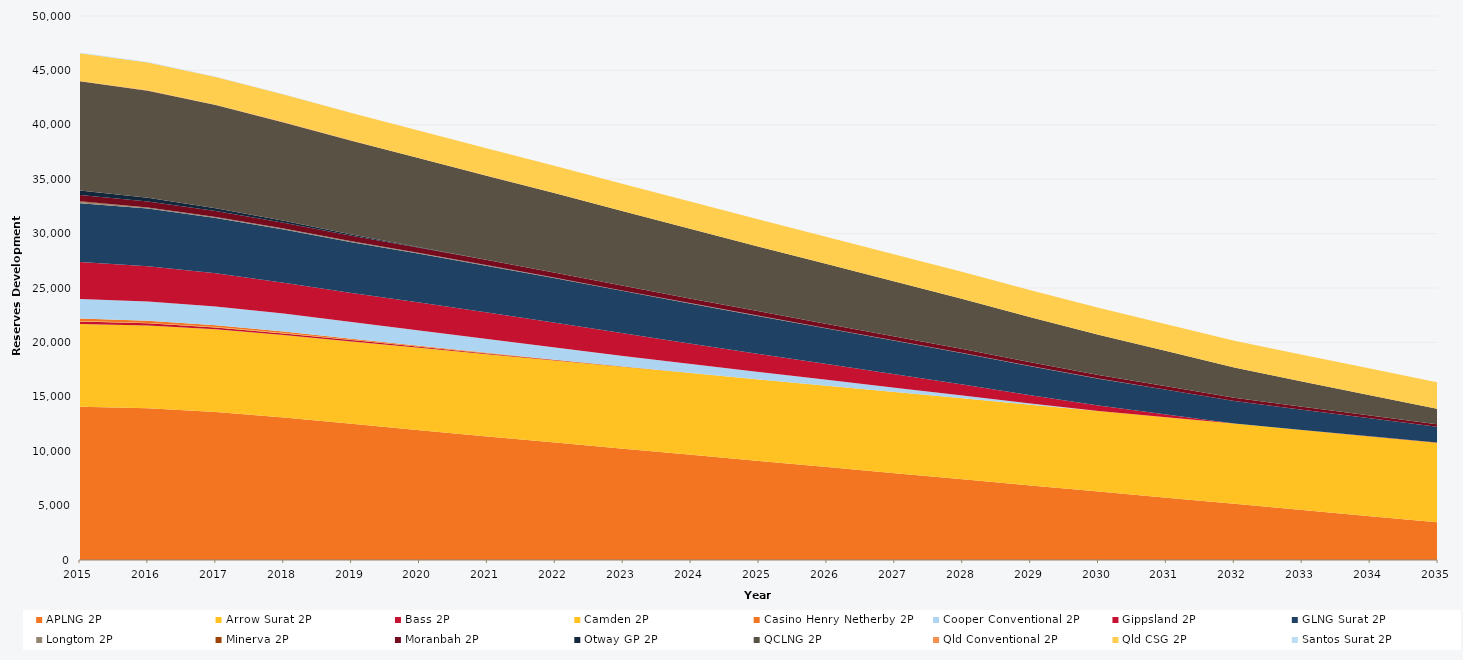
| Category | APLNG 2P | Arrow Surat 2P | Bass 2P | Camden 2P | Casino Henry Netherby 2P | Cooper Conventional 2P | Gippsland 2P | GLNG Surat 2P | Longtom 2P | Minerva 2P | Moranbah 2P | Otway GP 2P | QCLNG 2P | Qld Conventional 2P | Qld CSG 2P | Santos Surat 2P |
|---|---|---|---|---|---|---|---|---|---|---|---|---|---|---|---|---|
| 2015.0 | 14091 | 7605.789 | 221.176 | 45 | 225.66 | 1792.804 | 3415.402 | 5391 | 113.032 | 82.809 | 570 | 410.531 | 10028 | 41.53 | 2549.688 | 38.3 |
| 2016.0 | 13948.878 | 7605.789 | 196.721 | 39.525 | 196.46 | 1761.175 | 3261.827 | 5288.41 | 104.032 | 0 | 553.957 | 335.706 | 9845.121 | 41.53 | 2544.213 | 38.3 |
| 2017.0 | 13609.017 | 7599.232 | 172.199 | 34.035 | 167.18 | 1724.866 | 3042.351 | 5086.378 | 94.882 | 0 | 538.697 | 260.676 | 9487.928 | 36.822 | 2538.723 | 30.866 |
| 2018.0 | 13092.464 | 7586.853 | 147.744 | 28.56 | 137.98 | 1656.686 | 2843.47 | 4884.898 | 85.957 | 0 | 524.028 | 185.851 | 9046.743 | 28.792 | 2533.248 | 19.916 |
| 2019.0 | 12513.539 | 7577.274 | 123.289 | 23.085 | 108.78 | 1536.533 | 2649.076 | 4683.418 | 81.307 | 0 | 509.532 | 111.026 | 8609.478 | 20.762 | 2527.773 | 8.966 |
| 2020.0 | 11933.609 | 7567.783 | 98.834 | 17.61 | 79.58 | 1399.383 | 2568.693 | 4481.938 | 67.732 | 0 | 495.224 | 36.201 | 8172.239 | 12.732 | 2522.298 | 0 |
| 2021.0 | 11352.535 | 7558.157 | 74.312 | 12.12 | 50.3 | 1263.78 | 2439.401 | 4279.906 | 60.832 | 0 | 480.18 | 0 | 7733.696 | 4.68 | 2516.808 | 0 |
| 2022.0 | 10791.911 | 7543.751 | 49.857 | 6.645 | 21.1 | 1115.797 | 2277.988 | 4078.426 | 58.507 | 0 | 464.06 | 0 | 7291.426 | 0 | 2511.333 | 0 |
| 2023.0 | 10231.292 | 7527.747 | 25.402 | 1.17 | 0 | 969.633 | 2084.798 | 3876.946 | 36.077 | 0 | 447.743 | 0 | 6847.223 | 0 | 2505.858 | 0 |
| 2024.0 | 9670.038 | 7509.964 | 0.947 | 0 | 0 | 826.645 | 1877.691 | 3675.466 | 27.077 | 0 | 431.644 | 0 | 6398.108 | 0 | 2500.383 | 0 |
| 2025.0 | 9106.759 | 7492.322 | 0 | 0 | 0 | 683.437 | 1657.277 | 3473.434 | 27.077 | 0 | 414.885 | 0 | 5946.954 | 0 | 2494.893 | 0 |
| 2026.0 | 8545.321 | 7474.44 | 0 | 0 | 0 | 540.838 | 1444.521 | 3271.954 | 24.752 | 0 | 398.138 | 0 | 5499.141 | 0 | 2489.418 | 0 |
| 2027.0 | 7983.448 | 7457.619 | 0 | 0 | 0 | 398.439 | 1234.849 | 3070.474 | 18.994 | 0 | 381.016 | 0 | 5047.927 | 0 | 2483.943 | 0 |
| 2028.0 | 7420.904 | 7440.007 | 0 | 0 | 0 | 256.229 | 1018.055 | 2868.994 | 16.669 | 0 | 363.026 | 0 | 4597.261 | 0 | 2478.468 | 0 |
| 2029.0 | 6855.426 | 7418.792 | 0 | 0 | 0 | 100.282 | 768.051 | 2666.778 | 16.669 | 0 | 344.302 | 0 | 4147.813 | 0 | 2472.978 | 0 |
| 2030.0 | 6290.696 | 7399.594 | 0 | 0 | 0 | 1.278 | 513.473 | 2464.972 | 16.669 | 0 | 325.31 | 0 | 3696.424 | 0 | 2467.503 | 0 |
| 2031.0 | 5726.175 | 7386.969 | 0 | 0 | 0 | 1.278 | 264.983 | 2262.632 | 10.133 | 0 | 306.423 | 0 | 3242.694 | 0 | 2462.028 | 0 |
| 2032.0 | 5160.833 | 7374.303 | 0 | 0 | 0 | 1.278 | 11.865 | 2060.324 | 6.781 | 0 | 286.948 | 0 | 2785.296 | 0 | 2456.553 | 0 |
| 2033.0 | 4593.384 | 7346.685 | 0 | 0 | 0 | 1.278 | 11.865 | 1856.421 | 1.651 | 0 | 267.056 | 0 | 2333.785 | 0 | 2451.063 | 0 |
| 2034.0 | 4026.864 | 7330.251 | 0 | 0 | 0 | 1.278 | 11.865 | 1651.577 | 1.651 | 0 | 246.755 | 0 | 1877.738 | 0 | 2445.588 | 0 |
| 2035.0 | 3459.51 | 7316.318 | 0 | 0 | 0 | 1.278 | 11.865 | 1445.586 | 1.651 | 0 | 226.543 | 0 | 1422.182 | 0 | 2440.113 | 0 |